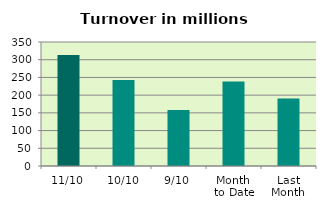
| Category | Series 0 |
|---|---|
| 11/10 | 313.595 |
| 10/10 | 242.561 |
| 9/10 | 158.393 |
| Month 
to Date | 238.185 |
| Last
Month | 190.73 |